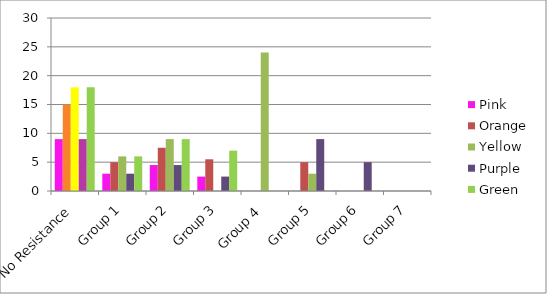
| Category | Pink | Orange | Yellow | Purple | Green |
|---|---|---|---|---|---|
| No Resistance | 9 | 15 | 18 | 9 | 18 |
| Group 1 | 3 | 5 | 6 | 3 | 6 |
| Group 2 | 4.5 | 7.5 | 9 | 4.5 | 9 |
| Group 3 | 2.5 | 5.5 | 0 | 2.5 | 7 |
| Group 4  | 0 | 0 | 24 | 0 | 0 |
| Group 5 | 0 | 5 | 3 | 9 | 0 |
| Group 6 | 0 | 0 | 0 | 5 | 0 |
| Group 7 | 0 | 0 | 0 | 0 | 0 |